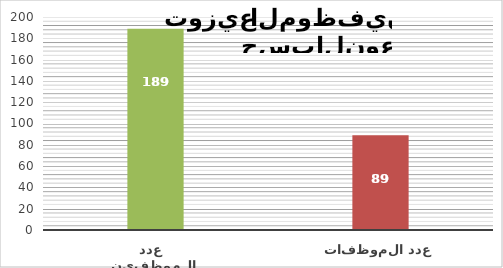
| Category | Series 1 |
|---|---|
| عدد الموظفين   | 189 |
| عدد الموظفات   | 89 |